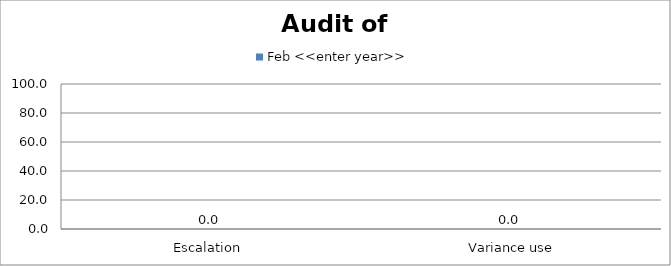
| Category | Feb <<enter year>> |
|---|---|
| Escalation  | 0 |
|  Variance use | 0 |